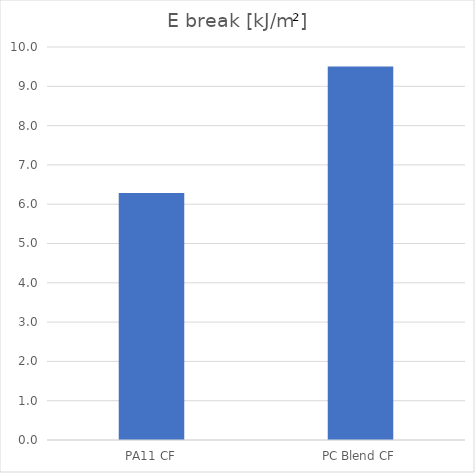
| Category | kJ/m² |
|---|---|
| PA11 CF | 6.285 |
| PC Blend CF | 9.503 |